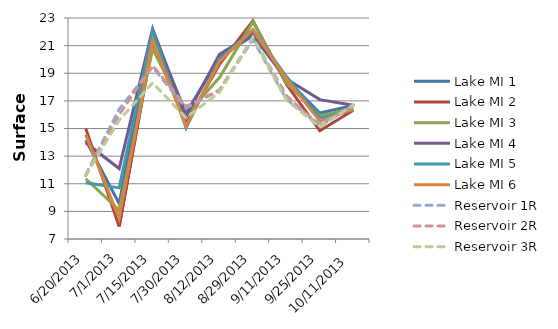
| Category | Lake MI 1 | Lake MI 2 | Lake MI 3 | Lake MI 4 | Lake MI 5 | Lake MI 6 | Reservoir 1R | Reservoir 2R | Reservoir 3R |
|---|---|---|---|---|---|---|---|---|---|
| 6/20/13 | 14.16 | 15.01 | 11.36 | 13.97 | 11.08 | 14.56 | 11.64 | 11.59 | 11.62 |
| 7/1/13 | 9.56 | 7.9 | 9.1 | 12.1 | 10.7 | 8.5 | 16.4 | 16 | 15.6 |
| 7/15/13 | 21.96 | 21.21 | 20.76 | 22.22 | 22.08 | 21.37 | 19.45 | 19.56 | 18.3 |
| 7/30/13 | 16.11 | 15.36 | 15.98 | 15.86 | 15.03 | 15.17 | 16.47 | 16.6 | 15.78 |
| 8/12/13 | 20.18 | 19.65 | 18.69 | 20.37 | 20.05 | 19.86 | 17.78 | 17.78 | 17.62 |
| 8/29/13 | 21.72 | 22.8 | 22.72 | 21.87 | 22.16 | 22.14 | 21.44 | 21.58 | 21.62 |
| 9/11/13 | 18.57 | 18.2 | 18.29 | 18.59 | 18.76 | 18.59 | 17.11 | 17.38 | 17.07 |
| 9/25/13 | 16.12 | 14.83 | 15.94 | 17.09 | 15.75 | 15.52 | 15.33 | 15.17 | 15.1 |
| 10/11/13 | 16.67 | 16.32 | 16.44 | 16.68 | 16.35 | 16.41 | 16.64 | 16.68 | 16.72 |